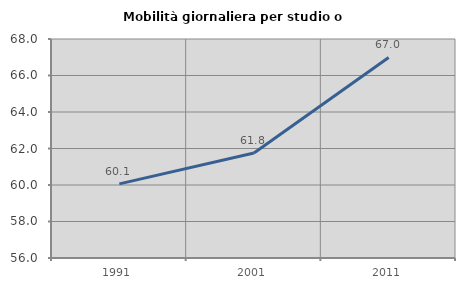
| Category | Mobilità giornaliera per studio o lavoro |
|---|---|
| 1991.0 | 60.06 |
| 2001.0 | 61.753 |
| 2011.0 | 66.99 |